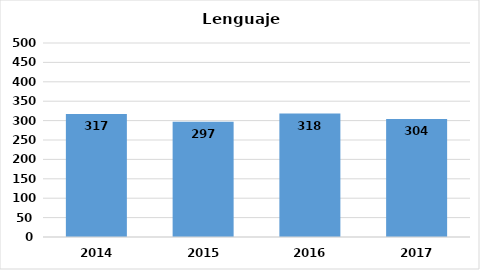
| Category | Series 0 |
|---|---|
| 2014.0 | 317 |
| 2015.0 | 297 |
| 2016.0 | 318 |
| 2017.0 | 304 |